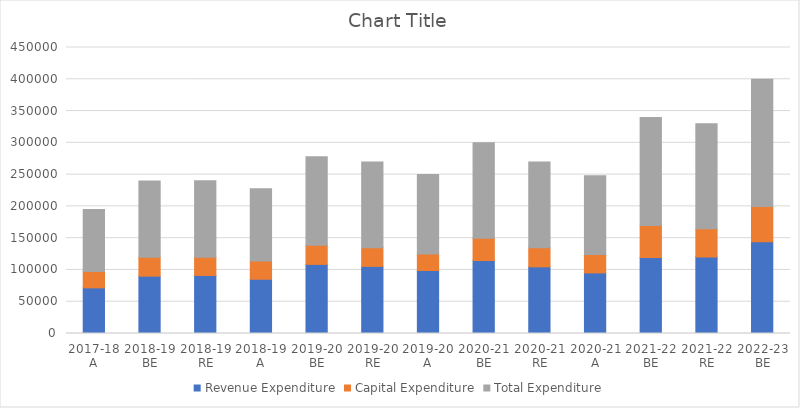
| Category | Revenue Expenditure | Capital Expenditure | Total Expenditure |
|---|---|---|---|
| 2017-18 A | 71837.3 | 25674.18 | 97511.48 |
| 2018-19 BE | 90220 | 29808 | 120028 |
| 2018-19 RE | 91327.85 | 28797.15 | 120125 |
| 2018-19 A | 85356.41 | 28592.09 | 113948.5 |
| 2019-20 BE | 108737.91 | 30262.09 | 139000 |
| 2019-20 RE | 105610.73 | 29389.27 | 135000 |
| 2019-20 A | 99137.3 | 26030.33 | 125167.63 |
| 2020-21 BE | 114790.86 | 35209.14 | 150000 |
| 2020-21 RE | 104863.91 | 30136.09 | 135000 |
| 2020-21 A | 95310.85 | 28798.29 | 124109.14 |
| 2021-22 BE | 119567.19 | 50432.81 | 170000 |
| 2021-22 RE | 120365.11 | 44634.55 | 164999.66 |
| 2022-23 BE | 144348.67 | 55651.33 | 200000 |